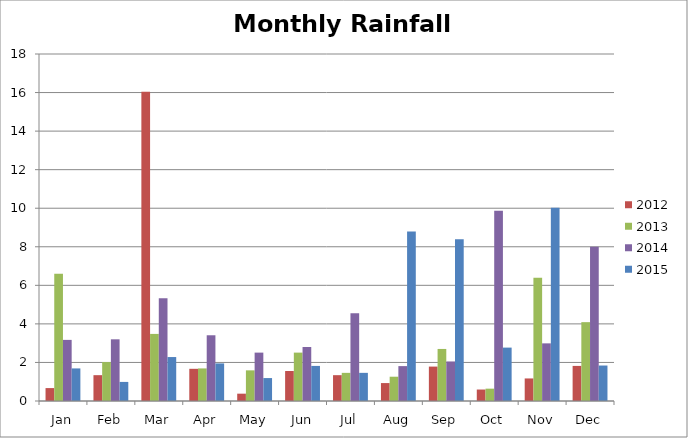
| Category | 2012 | 2013 | 2014 | 2015 |
|---|---|---|---|---|
| Jan | 0.67 | 6.6 | 3.17 | 1.69 |
| Feb | 1.34 | 2.02 | 3.2 | 0.99 |
| Mar | 16.04 | 3.48 | 5.33 | 2.28 |
| Apr | 1.67 | 1.69 | 3.41 | 1.95 |
| May | 0.38 | 1.59 | 2.51 | 1.19 |
| Jun | 1.555 | 2.51 | 2.8 | 1.82 |
| Jul | 1.34 | 1.46 | 4.55 | 1.46 |
| Aug | 0.93 | 1.26 | 1.81 | 8.79 |
| Sep | 1.785 | 2.7 | 2.05 | 8.39 |
| Oct | 0.595 | 0.64 | 9.87 | 2.77 |
| Nov | 1.17 | 6.39 | 2.99 | 10.03 |
| Dec | 1.82 | 4.09 | 8 | 1.84 |